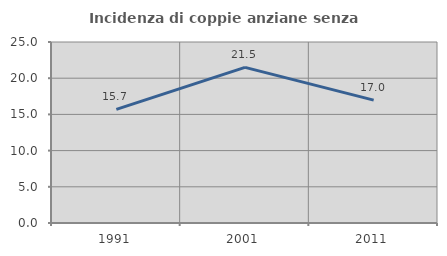
| Category | Incidenza di coppie anziane senza figli  |
|---|---|
| 1991.0 | 15.702 |
| 2001.0 | 21.493 |
| 2011.0 | 16.976 |